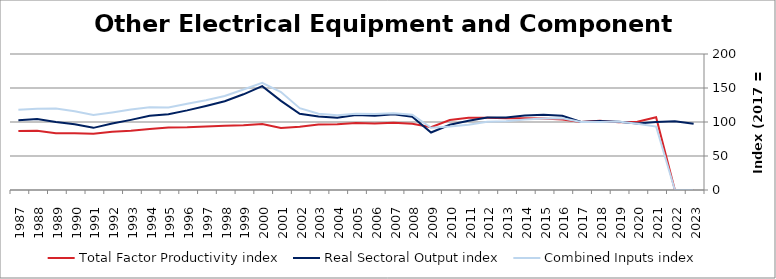
| Category | Total Factor Productivity index | Real Sectoral Output index | Combined Inputs index |
|---|---|---|---|
| 2023.0 | 0 | 97.27 | 0 |
| 2022.0 | 0 | 101.203 | 0 |
| 2021.0 | 106.985 | 99.845 | 93.326 |
| 2020.0 | 100.252 | 97.772 | 97.526 |
| 2019.0 | 99.519 | 100.358 | 100.843 |
| 2018.0 | 101.668 | 101.552 | 99.886 |
| 2017.0 | 100 | 100 | 100 |
| 2016.0 | 103.533 | 109.204 | 105.478 |
| 2015.0 | 104.968 | 110.503 | 105.273 |
| 2014.0 | 105.435 | 109.381 | 103.743 |
| 2013.0 | 105.637 | 106.793 | 101.094 |
| 2012.0 | 106.137 | 106.552 | 100.39 |
| 2011.0 | 106.234 | 101.926 | 95.945 |
| 2010.0 | 102.82 | 95.987 | 93.355 |
| 2009.0 | 92.289 | 84.55 | 91.614 |
| 2008.0 | 97.327 | 107.766 | 110.726 |
| 2007.0 | 98.814 | 111.553 | 112.891 |
| 2006.0 | 97.642 | 109.205 | 111.842 |
| 2005.0 | 98.365 | 110.446 | 112.282 |
| 2004.0 | 96.758 | 106.356 | 109.92 |
| 2003.0 | 96.222 | 108.011 | 112.253 |
| 2002.0 | 93.042 | 111.987 | 120.361 |
| 2001.0 | 91.033 | 131.089 | 144.002 |
| 2000.0 | 96.981 | 152.747 | 157.502 |
| 1999.0 | 95.171 | 140.737 | 147.878 |
| 1998.0 | 94.41 | 130.592 | 138.323 |
| 1997.0 | 93.53 | 123.577 | 132.125 |
| 1996.0 | 92.27 | 117.064 | 126.871 |
| 1995.0 | 91.873 | 111.483 | 121.345 |
| 1994.0 | 89.593 | 109.15 | 121.828 |
| 1993.0 | 87.098 | 103.145 | 118.424 |
| 1992.0 | 85.596 | 97.662 | 114.097 |
| 1991.0 | 82.851 | 91.396 | 110.314 |
| 1990.0 | 83.6 | 96.707 | 115.677 |
| 1989.0 | 83.408 | 99.986 | 119.876 |
| 1988.0 | 87.233 | 104.332 | 119.602 |
| 1987.0 | 86.78 | 102.472 | 118.082 |